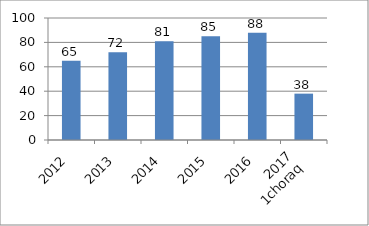
| Category | Series 0 |
|---|---|
| 2012 | 65 |
| 2013 | 72 |
| 2014 | 81 |
| 2015 | 85 |
| 2016 | 88 |
| 2017
1choraq | 38 |